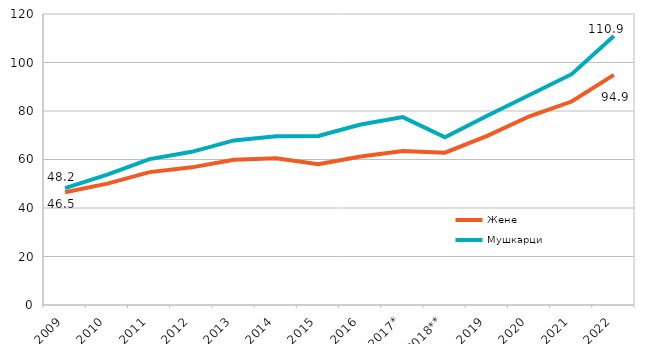
| Category | Жене | Мушкарци |
|---|---|---|
| 2009 | 46.489 | 48.197 |
| 2010 | 50.049 | 53.792 |
| 2011 | 54.792 | 60.148 |
| 2012 | 56.765 | 63.157 |
| 2013 | 59.891 | 67.86 |
| 2014 | 60.498 | 69.624 |
| 2015 | 58.063 | 69.725 |
| 2016 | 61.203 | 74.447 |
| 2017* | 63.49 | 77.466 |
| 2018** | 62.792 | 69.12 |
| 2019 | 69.73 | 78.029 |
| 2020 | 77.826 | 86.622 |
| 2021 | 83.908 | 95.178 |
| 2022 | 94.911 | 110.915 |